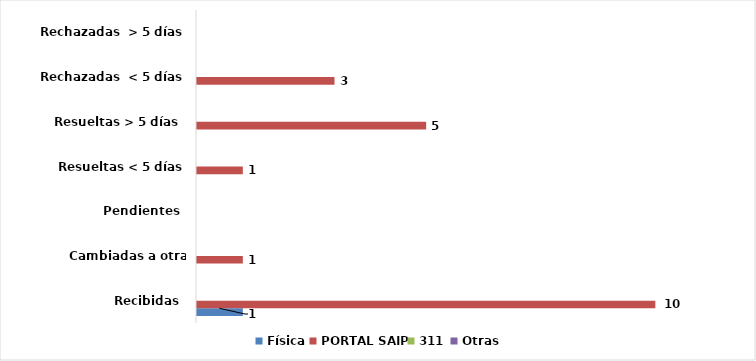
| Category | Física | PORTAL SAIP | 311 | Otras |
|---|---|---|---|---|
| Recibidas  | 1 | 10 | 0 | 0 |
| Cambiadas a otra institución | 0 | 1 | 0 | 0 |
| Pendientes  | 0 | 0 | 0 | 0 |
| Resueltas < 5 días | 0 | 1 | 0 | 0 |
| Resueltas > 5 días  | 0 | 5 | 0 | 0 |
| Rechazadas  < 5 días | 0 | 3 | 0 | 0 |
| Rechazadas  > 5 días | 0 | 0 | 0 | 0 |